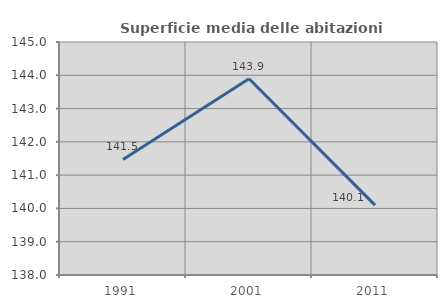
| Category | Superficie media delle abitazioni occupate |
|---|---|
| 1991.0 | 141.471 |
| 2001.0 | 143.895 |
| 2011.0 | 140.101 |